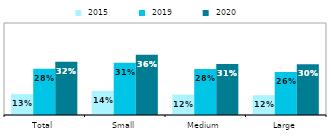
| Category |  2015 |  2019 |  2020 |
|---|---|---|---|
| Total | 0.125 | 0.276 | 0.318 |
| Small | 0.144 | 0.312 | 0.36 |
| Medium | 0.122 | 0.275 | 0.305 |
| Large | 0.118 | 0.257 | 0.304 |